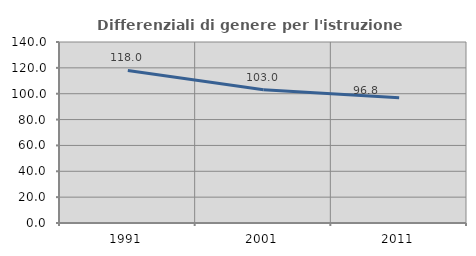
| Category | Differenziali di genere per l'istruzione superiore |
|---|---|
| 1991.0 | 118.002 |
| 2001.0 | 103.047 |
| 2011.0 | 96.801 |